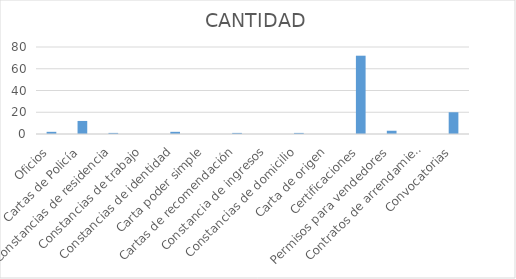
| Category | CANTIDAD |
|---|---|
| Oficios | 2 |
| Cartas de Policía | 12 |
| Constancias de residencia  | 1 |
| Constancias de trabajo | 0 |
| Constancias de identidad | 2 |
| Carta poder simple | 0 |
| Cartas de recomendación | 1 |
| Constancia de ingresos | 0 |
| Constancias de domicilio | 1 |
| Carta de origen | 0 |
| Certificaciones | 72 |
| Permisos para vendedores | 3 |
| Contratos de arrendamiento | 0 |
| Convocatorias | 20 |